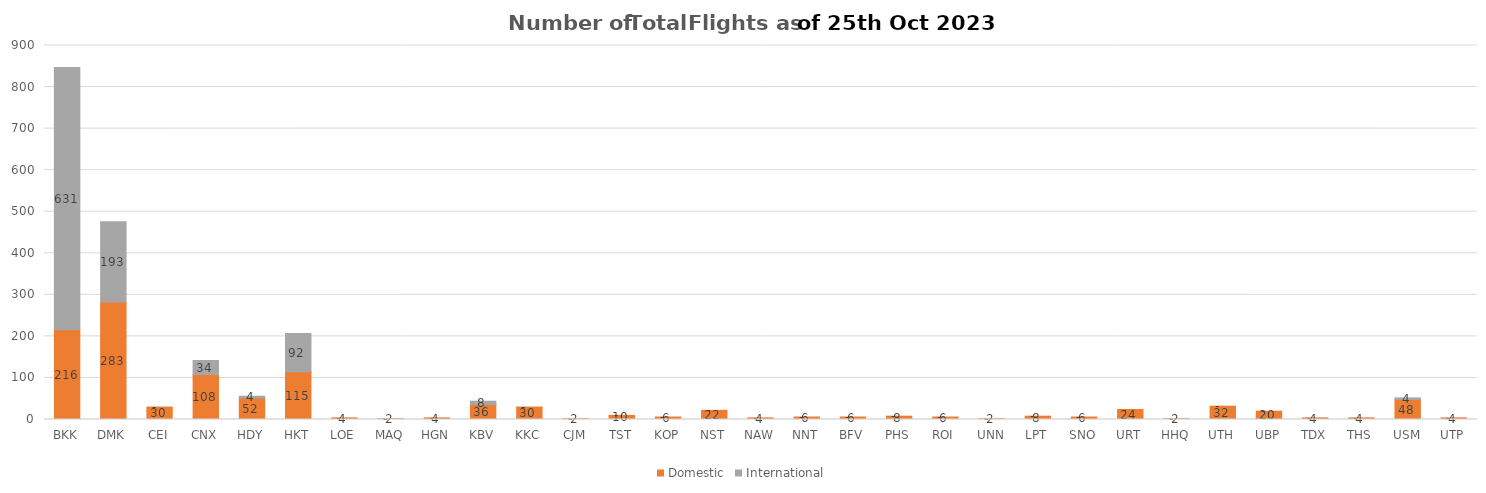
| Category | Domestic | International |
|---|---|---|
| BKK | 216 | 631 |
| DMK | 283 | 193 |
| CEI | 30 | 0 |
| CNX | 108 | 34 |
| HDY | 52 | 4 |
| HKT | 115 | 92 |
| LOE | 4 | 0 |
| MAQ | 2 | 0 |
| HGN | 4 | 0 |
| KBV | 36 | 8 |
| KKC | 30 | 0 |
| CJM | 2 | 0 |
| TST | 10 | 0 |
| KOP | 6 | 0 |
| NST | 22 | 0 |
| NAW | 4 | 0 |
| NNT | 6 | 0 |
| BFV | 6 | 0 |
| PHS | 8 | 0 |
| ROI | 6 | 0 |
| UNN | 2 | 0 |
| LPT | 8 | 0 |
| SNO | 6 | 0 |
| URT | 24 | 0 |
| HHQ | 2 | 0 |
| UTH | 32 | 0 |
| UBP | 20 | 0 |
| TDX | 4 | 0 |
| THS | 4 | 0 |
| USM | 48 | 4 |
| UTP | 4 | 0 |